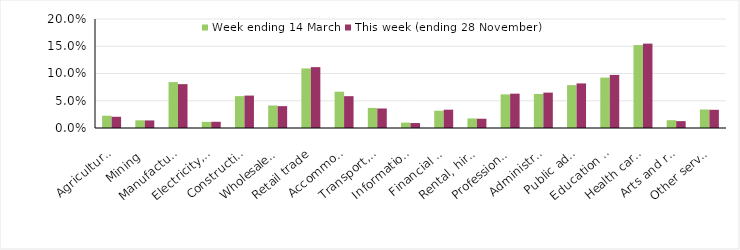
| Category | Week ending 14 March | This week (ending 28 November) |
|---|---|---|
| Agriculture, forestry and fishing | 0.022 | 0.021 |
| Mining | 0.014 | 0.014 |
| Manufacturing | 0.084 | 0.08 |
| Electricity, gas, water and waste services | 0.011 | 0.011 |
| Construction | 0.058 | 0.06 |
| Wholesale trade | 0.041 | 0.04 |
| Retail trade | 0.109 | 0.112 |
| Accommodation and food services | 0.067 | 0.058 |
| Transport, postal and warehousing | 0.037 | 0.036 |
| Information media and telecommunications | 0.01 | 0.009 |
| Financial and insurance services | 0.032 | 0.034 |
| Rental, hiring and real estate services | 0.018 | 0.017 |
| Professional, scientific and technical services | 0.062 | 0.063 |
| Administrative and support services | 0.062 | 0.065 |
| Public administration and safety | 0.079 | 0.082 |
| Education and training | 0.092 | 0.097 |
| Health care and social assistance | 0.152 | 0.155 |
| Arts and recreation services | 0.014 | 0.013 |
| Other services | 0.034 | 0.033 |